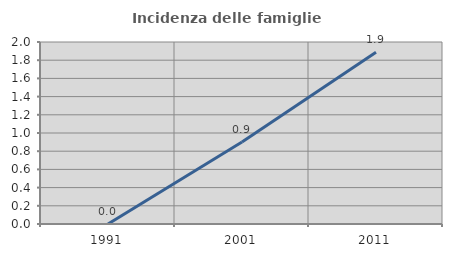
| Category | Incidenza delle famiglie numerose |
|---|---|
| 1991.0 | 0 |
| 2001.0 | 0.901 |
| 2011.0 | 1.887 |